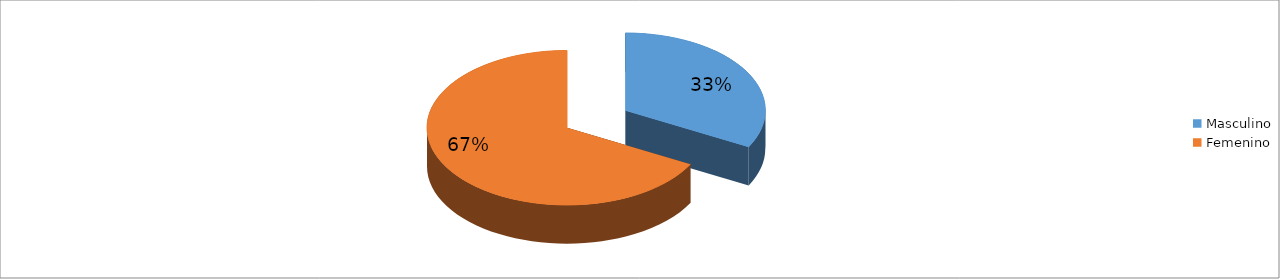
| Category | Series 0 |
|---|---|
| Masculino | 0.328 |
| Femenino | 0.672 |